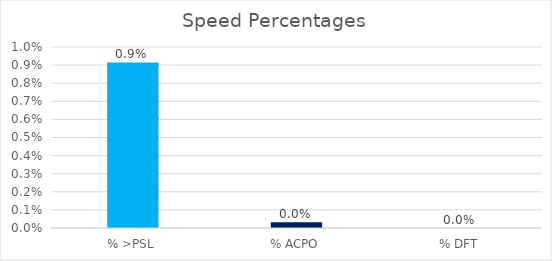
| Category | Series 0 |
|---|---|
| % >PSL | 0.009 |
| % ACPO | 0 |
| % DFT | 0 |